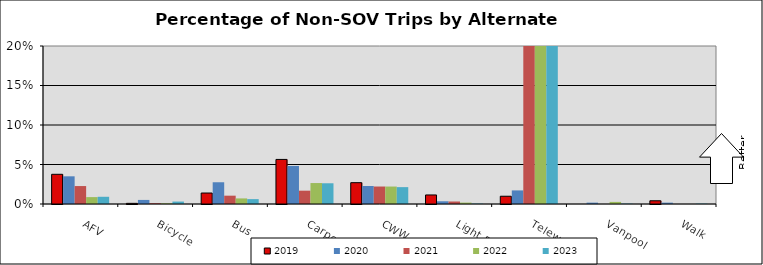
| Category | 2019 | 2020 | 2021 | 2022 | 2023 |
|---|---|---|---|---|---|
| AFV | 0.038 | 0.035 | 0.023 | 0.009 | 0.009 |
| Bicycle | 0.001 | 0.005 | 0.001 | 0.001 | 0.003 |
| Bus | 0.014 | 0.028 | 0.011 | 0.007 | 0.006 |
| Carpool | 0.056 | 0.048 | 0.017 | 0.027 | 0.026 |
| CWW | 0.027 | 0.023 | 0.022 | 0.022 | 0.021 |
| Light Rail | 0.011 | 0.003 | 0.003 | 0.002 | 0.001 |
| Telework | 0.01 | 0.017 | 0.585 | 0.614 | 0.61 |
| Vanpool | 0 | 0.002 | 0 | 0.003 | 0.001 |
| Walk | 0.004 | 0.002 | 0 | 0 | 0.001 |